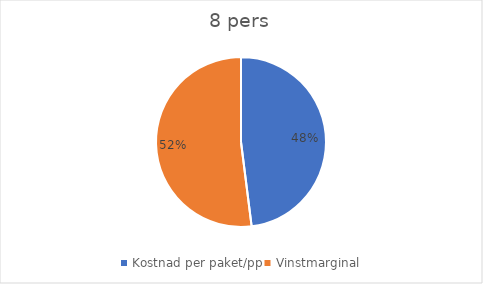
| Category | Series 0 |
|---|---|
| Kostnad per paket/pp | 6000 |
| Vinstmarginal | 6500 |